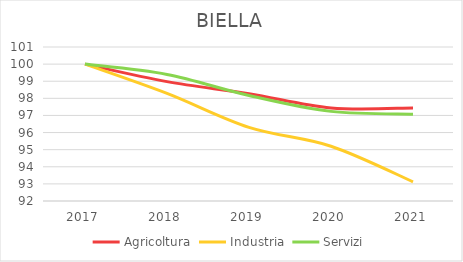
| Category | Agricoltura | Industria | Servizi |
|---|---|---|---|
| 2017.0 | 100 | 100 | 100 |
| 2018.0 | 98.976 | 98.29 | 99.398 |
| 2019.0 | 98.273 | 96.304 | 98.17 |
| 2020.0 | 97.441 | 95.201 | 97.238 |
| 2021.0 | 97.441 | 93.124 | 97.073 |